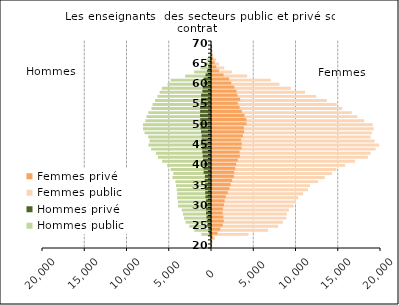
| Category | Femmes public | Femmes privé |
|---|---|---|
| 20.0 | 10 | 2 |
| 21.0 | 75 | 29 |
| 22.0 | 353 | 116 |
| 23.0 | 4318 | 652 |
| 24.0 | 6639 | 973 |
| 25.0 | 7815 | 1261 |
| 26.0 | 8380 | 1396 |
| 27.0 | 8795 | 1345 |
| 28.0 | 8855 | 1262 |
| 29.0 | 9101 | 1294 |
| 30.0 | 9674 | 1414 |
| 31.0 | 9939 | 1496 |
| 32.0 | 10210 | 1625 |
| 33.0 | 10784 | 1864 |
| 34.0 | 11356 | 2071 |
| 35.0 | 11588 | 2208 |
| 36.0 | 12555 | 2387 |
| 37.0 | 13344 | 2582 |
| 38.0 | 14192 | 2630 |
| 39.0 | 14730 | 2753 |
| 40.0 | 15758 | 2853 |
| 41.0 | 16927 | 3061 |
| 42.0 | 18437 | 3290 |
| 43.0 | 18752 | 3265 |
| 44.0 | 19373 | 3488 |
| 45.0 | 19771 | 3524 |
| 46.0 | 19257 | 3419 |
| 47.0 | 18766 | 3653 |
| 48.0 | 18921 | 3788 |
| 49.0 | 19138 | 3781 |
| 50.0 | 19031 | 4088 |
| 51.0 | 18013 | 4073 |
| 52.0 | 17204 | 3849 |
| 53.0 | 16535 | 3526 |
| 54.0 | 15408 | 3262 |
| 55.0 | 14754 | 3049 |
| 56.0 | 13590 | 3332 |
| 57.0 | 12338 | 3021 |
| 58.0 | 11005 | 2894 |
| 59.0 | 9333 | 2639 |
| 60.0 | 7976 | 2278 |
| 61.0 | 6952 | 2025 |
| 62.0 | 4162 | 1365 |
| 63.0 | 2383 | 814 |
| 64.0 | 1442 | 501 |
| 65.0 | 842 | 320 |
| 66.0 | 481 | 160 |
| 67.0 | 135 | 45 |
| 68.0 | 52 | 12 |
| 69.0 | 7 | 1 |
| 70.0 | 1 | 3 |